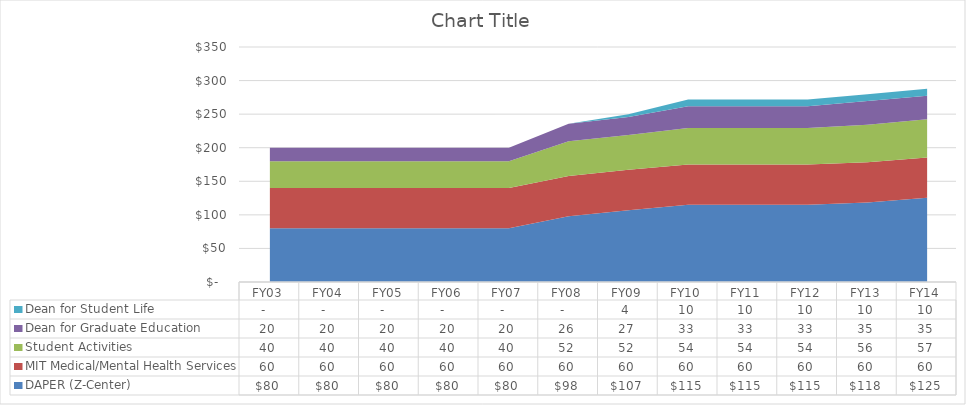
| Category | DAPER (Z-Center) | MIT Medical/Mental Health Services | Student Activities | Dean for Graduate Education | Dean for Student Life |
|---|---|---|---|---|---|
| FY03 | 80 | 60 | 40 | 20 | 0 |
| FY04 | 80 | 60 | 40 | 20 | 0 |
| FY05 | 80 | 60 | 40 | 20 | 0 |
| FY06 | 80 | 60 | 40 | 20 | 0 |
| FY07 | 80 | 60 | 40 | 20 | 0 |
| FY08 | 98 | 60 | 51.8 | 26 | 0 |
| FY09 | 107 | 60 | 51.8 | 27 | 4 |
| FY10 | 115 | 60 | 54.3 | 32.5 | 10 |
| FY11 | 115 | 60 | 54.3 | 32.5 | 10 |
| FY12 | 115 | 60 | 54.3 | 32.5 | 10 |
| FY13 | 118.3 | 60 | 56 | 35.2 | 10.3 |
| FY14 | 125.4 | 60 | 56.9 | 35.2 | 10.3 |